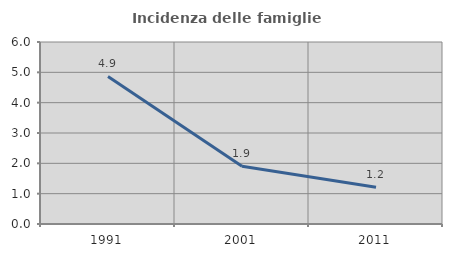
| Category | Incidenza delle famiglie numerose |
|---|---|
| 1991.0 | 4.866 |
| 2001.0 | 1.906 |
| 2011.0 | 1.212 |